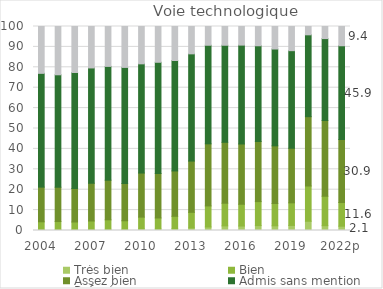
| Category | Très bien | Bien | Assez bien | Admis sans mention | Refusé |
|---|---|---|---|---|---|
| 2004 | 0.382 | 3.886 | 16.998 | 55.774 | 22.961 |
| 2005 | 0.46 | 3.929 | 16.822 | 55.12 | 23.67 |
| 2006 | 0.433 | 3.734 | 16.415 | 56.874 | 22.543 |
| 2007 | 0.509 | 4.15 | 18.507 | 56.521 | 20.314 |
| 2008 | 0.58 | 4.647 | 19.43 | 55.792 | 19.552 |
| 2009 | 0.553 | 4.213 | 18.266 | 56.915 | 20.053 |
| 2010 | 0.78 | 5.775 | 21.619 | 53.523 | 18.304 |
| 2011 | 0.733 | 5.412 | 21.798 | 54.523 | 17.534 |
| 2012 | 0.88 | 6.081 | 22.228 | 54.13 | 16.681 |
| 2013 | 1.246 | 7.66 | 25.129 | 52.556 | 13.408 |
| 2014 | 1.727 | 10.316 | 30.442 | 48.32 | 9.195 |
| 2015 | 2.263 | 11.105 | 29.858 | 47.582 | 9.192 |
| 2016 | 2.191 | 10.686 | 29.533 | 48.465 | 9.125 |
| 2017 | 2.413 | 11.747 | 29.479 | 46.915 | 9.445 |
| 2018 | 2.295 | 10.937 | 28.262 | 47.473 | 11.034 |
| 2019 | 2.49 | 11.067 | 26.758 | 47.836 | 11.848 |
| 2020 | 4.53 | 17.279 | 33.982 | 40.133 | 4.075 |
| 2021 | 2.362 | 14.429 | 37.124 | 40.162 | 5.923 |
| 2022p | 2.113 | 11.593 | 30.914 | 45.94 | 9.44 |